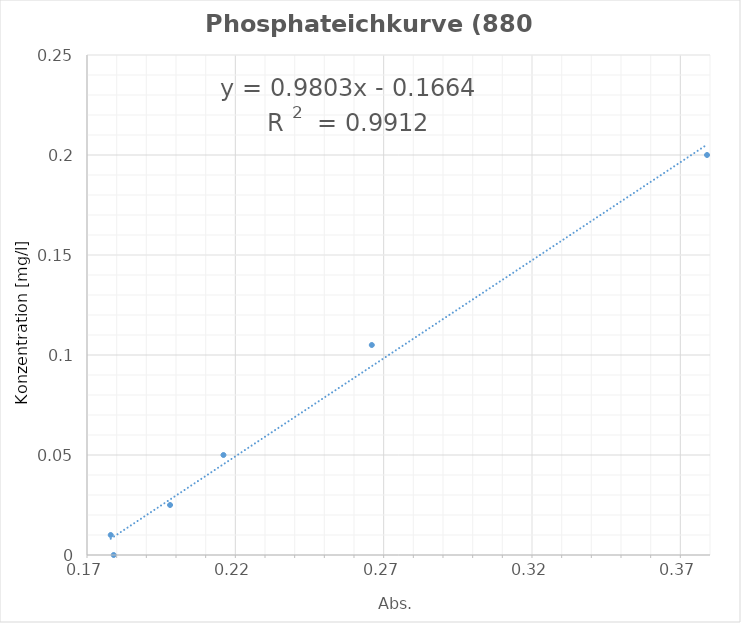
| Category | Series 0 |
|---|---|
| 0.179 | 0 |
| 0.178 | 0.01 |
| 0.198 | 0.025 |
| 0.216 | 0.05 |
| 0.266 | 0.105 |
| 0.379 | 0.2 |